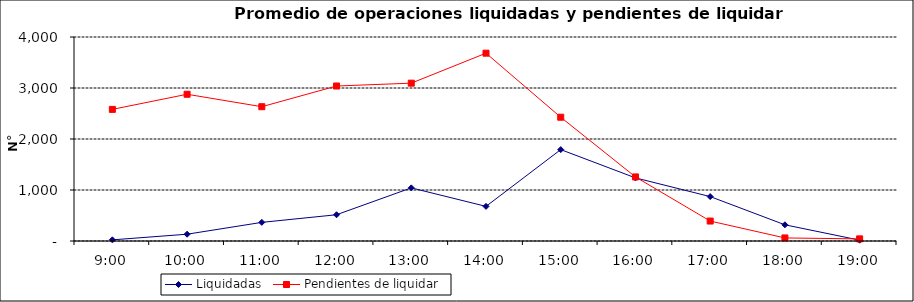
| Category | Liquidadas | Pendientes de liquidar |
|---|---|---|
| 0.375 | 22.579 | 2580.632 |
| 0.4166666666666667 | 133.211 | 2877.211 |
| 0.4583333333333333 | 365.211 | 2633.211 |
| 0.5 | 515 | 3039 |
| 0.5416666666666666 | 1041.737 | 3094.842 |
| 0.5833333333333334 | 678.842 | 3682.895 |
| 0.625 | 1792 | 2426.895 |
| 0.6666666666666666 | 1237.737 | 1256.421 |
| 0.7083333333333334 | 870.789 | 391.316 |
| 0.75 | 317.526 | 59.842 |
| 0.7916666666666666 | 16.842 | 41.579 |